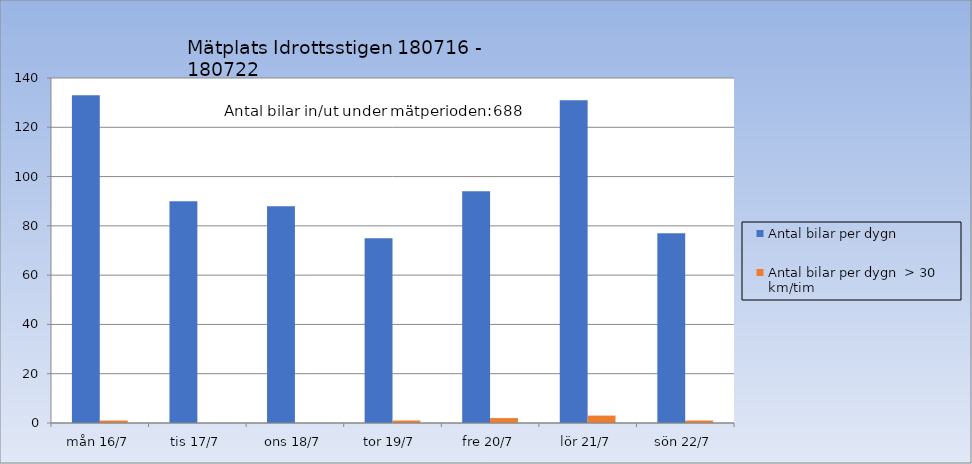
| Category | Antal bilar per dygn | Antal bilar per dygn  > 30 km/tim |
|---|---|---|
| mån 16/7 | 133 | 1 |
| tis 17/7 | 90 | 0 |
| ons 18/7 | 88 | 0 |
| tor 19/7 | 75 | 1 |
| fre 20/7 | 94 | 2 |
| lör 21/7 | 131 | 3 |
| sön 22/7 | 77 | 1 |